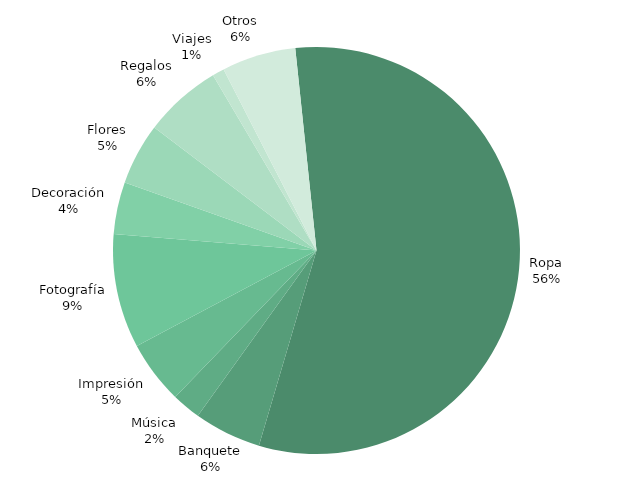
| Category | REAL |
|---|---|
| Ropa | 9770 |
| Banquete | 928 |
| Música | 400 |
| Impresión | 870 |
| Fotografía | 1575 |
| Decoración | 720 |
| Flores | 850 |
| Regalos | 1075 |
| Viajes | 165 |
| Otros | 1021 |